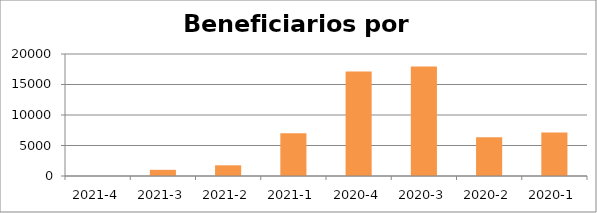
| Category | Series 0 |
|---|---|
| 2021-4 | 0 |
| 2021-3 | 1012 |
| 2021-2 | 1753 |
| 2021-1 | 7005 |
| 2020-4 | 17145 |
| 2020-3 | 17941 |
| 2020-2 | 6356 |
| 2020-1 | 7141 |